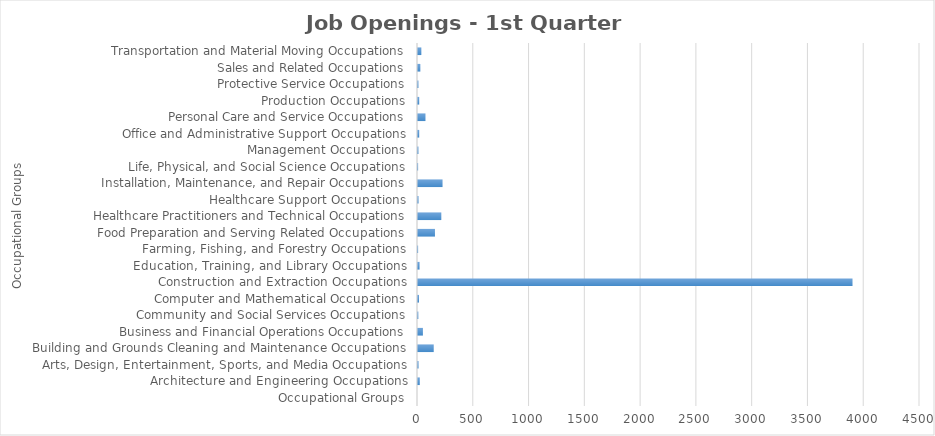
| Category | Series1 |
|---|---|
| Occupational Groups | 0 |
| Architecture and Engineering Occupations | 16 |
| Arts, Design, Entertainment, Sports, and Media Occupations | 5 |
| Building and Grounds Cleaning and Maintenance Occupations | 141 |
| Business and Financial Operations Occupations | 44 |
| Community and Social Services Occupations | 3 |
| Computer and Mathematical Occupations | 9 |
| Construction and Extraction Occupations | 3895 |
| Education, Training, and Library Occupations | 14 |
| Farming, Fishing, and Forestry Occupations | 1 |
| Food Preparation and Serving Related Occupations | 152 |
| Healthcare Practitioners and Technical Occupations | 209 |
| Healthcare Support Occupations | 5 |
| Installation, Maintenance, and Repair Occupations | 220 |
| Life, Physical, and Social Science Occupations | 1 |
| Management Occupations | 4 |
| Office and Administrative Support Occupations | 11 |
| Personal Care and Service Occupations | 67 |
| Production Occupations | 11 |
| Protective Service Occupations | 4 |
| Sales and Related Occupations | 21 |
| Transportation and Material Moving Occupations | 30 |